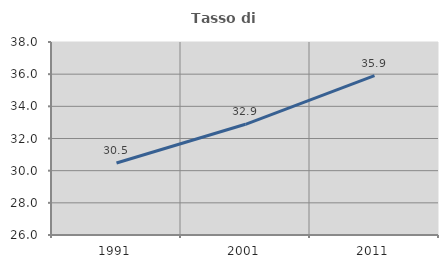
| Category | Tasso di occupazione   |
|---|---|
| 1991.0 | 30.476 |
| 2001.0 | 32.884 |
| 2011.0 | 35.91 |